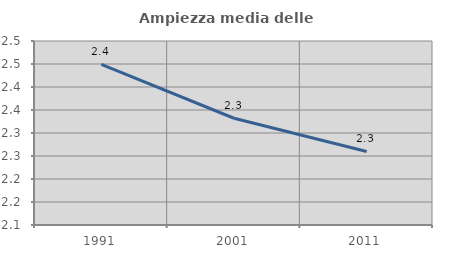
| Category | Ampiezza media delle famiglie |
|---|---|
| 1991.0 | 2.449 |
| 2001.0 | 2.332 |
| 2011.0 | 2.26 |